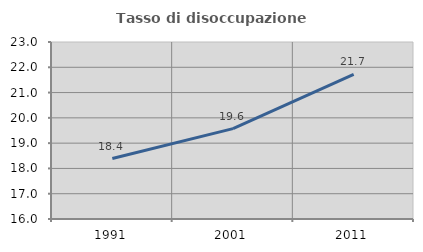
| Category | Tasso di disoccupazione giovanile  |
|---|---|
| 1991.0 | 18.391 |
| 2001.0 | 19.575 |
| 2011.0 | 21.723 |